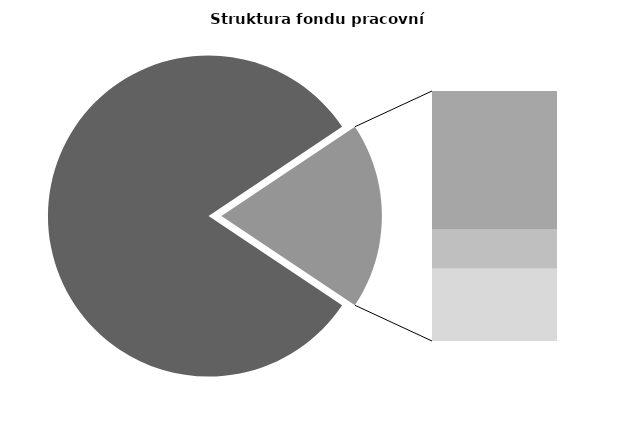
| Category | Series 0 |
|---|---|
| Průměrná měsíční odpracovaná doba bez přesčasu | 140.009 |
| Dovolená | 17.835 |
| Nemoc | 5.131 |
| Jiné | 9.357 |